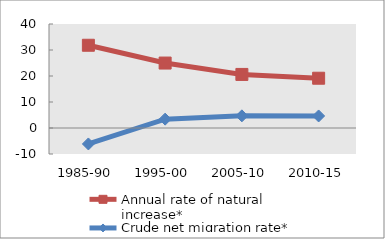
| Category | Annual rate of natural increase* | Crude net migration rate* |
|---|---|---|
| 1985-90 | 31.821 | -6.133 |
| 1995-00 | 24.981 | 3.41 |
| 2005-10 | 20.601 | 4.67 |
| 2010-15 | 19.145 | 4.63 |